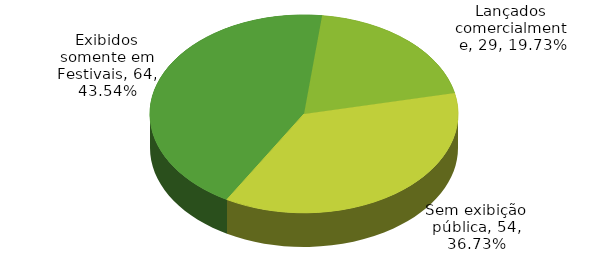
| Category | Series 0 |
|---|---|
| Exibidos somente em Festivais | 64 |
| Lançados comercialmente | 29 |
| Sem exibição pública | 54 |